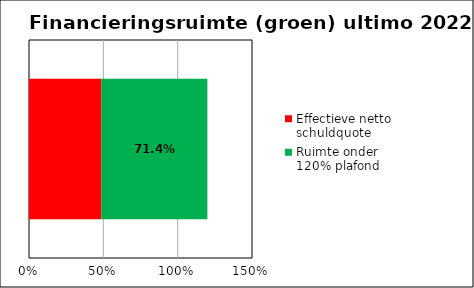
| Category | Effectieve netto schuldquote | Ruimte onder 120% plafond |
|---|---|---|
| Effectieve netto schuldquote 2022 | 0.486 | 0.714 |